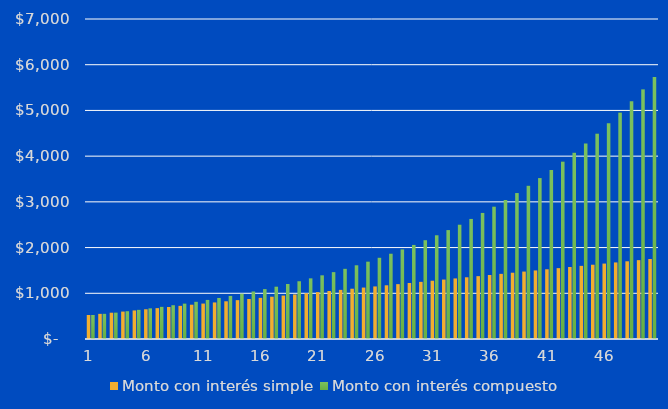
| Category | Monto con interés simple | Monto con interés compuesto |
|---|---|---|
| 1.0 | 525 | 525 |
| 2.0 | 550 | 551.25 |
| 3.0 | 575 | 578.812 |
| 4.0 | 600 | 607.753 |
| 5.0 | 625 | 638.141 |
| 6.0 | 650 | 670.048 |
| 7.0 | 675 | 703.55 |
| 8.0 | 700 | 738.728 |
| 9.0 | 725 | 775.664 |
| 10.0 | 750 | 814.447 |
| 11.0 | 775 | 855.17 |
| 12.0 | 800 | 897.928 |
| 13.0 | 825 | 942.825 |
| 14.0 | 850 | 989.966 |
| 15.0 | 875 | 1039.464 |
| 16.0 | 900 | 1091.437 |
| 17.0 | 925 | 1146.009 |
| 18.0 | 950 | 1203.31 |
| 19.0 | 975 | 1263.475 |
| 20.0 | 1000 | 1326.649 |
| 21.0 | 1025 | 1392.981 |
| 22.0 | 1050 | 1462.63 |
| 23.0 | 1075 | 1535.762 |
| 24.0 | 1100 | 1612.55 |
| 25.0 | 1125 | 1693.177 |
| 26.0 | 1150 | 1777.836 |
| 27.0 | 1175 | 1866.728 |
| 28.0 | 1200 | 1960.065 |
| 29.0 | 1225 | 2058.068 |
| 30.0 | 1250 | 2160.971 |
| 31.0 | 1275 | 2269.02 |
| 32.0 | 1300 | 2382.471 |
| 33.0 | 1325 | 2501.594 |
| 34.0 | 1350 | 2626.674 |
| 35.0 | 1375 | 2758.008 |
| 36.0 | 1400 | 2895.908 |
| 37.0 | 1425 | 3040.703 |
| 38.0 | 1450 | 3192.739 |
| 39.0 | 1475 | 3352.376 |
| 40.0 | 1500 | 3519.994 |
| 41.0 | 1525 | 3695.994 |
| 42.0 | 1550 | 3880.794 |
| 43.0 | 1575 | 4074.833 |
| 44.0 | 1600 | 4278.575 |
| 45.0 | 1625 | 4492.504 |
| 46.0 | 1650 | 4717.129 |
| 47.0 | 1675 | 4952.986 |
| 48.0 | 1700 | 5200.635 |
| 49.0 | 1725 | 5460.667 |
| 50.0 | 1750 | 5733.7 |